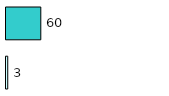
| Category | Series 0 | Series 1 |
|---|---|---|
| 0 | 3 | 60 |